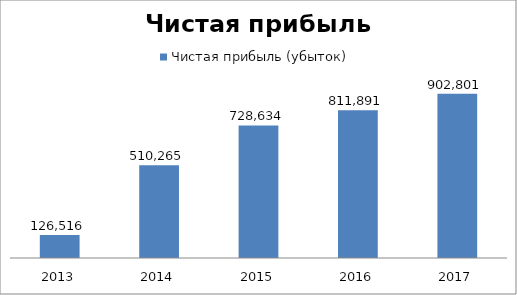
| Category | Чистая прибыль (убыток) |
|---|---|
| 2013.0 | 126516.096 |
| 2014.0 | 510264.85 |
| 2015.0 | 728634.3 |
| 2016.0 | 811891.451 |
| 2017.0 | 902800.646 |